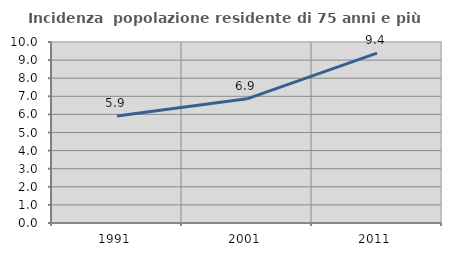
| Category | Incidenza  popolazione residente di 75 anni e più |
|---|---|
| 1991.0 | 5.918 |
| 2001.0 | 6.862 |
| 2011.0 | 9.389 |